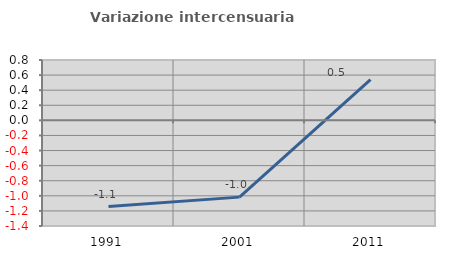
| Category | Variazione intercensuaria annua |
|---|---|
| 1991.0 | -1.142 |
| 2001.0 | -1.017 |
| 2011.0 | 0.539 |